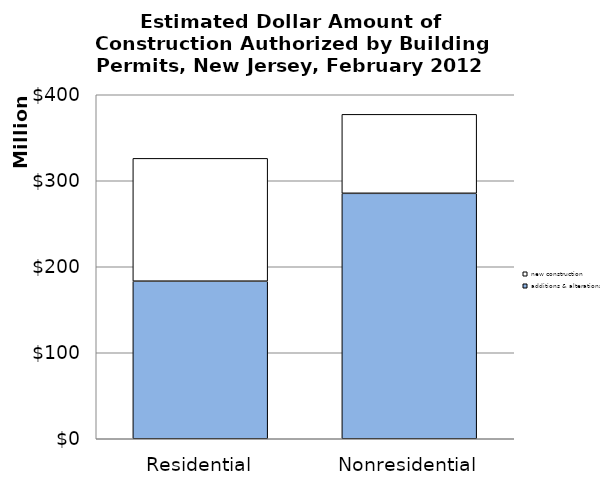
| Category | additions & alterations | new construction |
|---|---|---|
| Residential | 183222720 | 142828780 |
| Nonresidential | 285405713 | 91822622 |